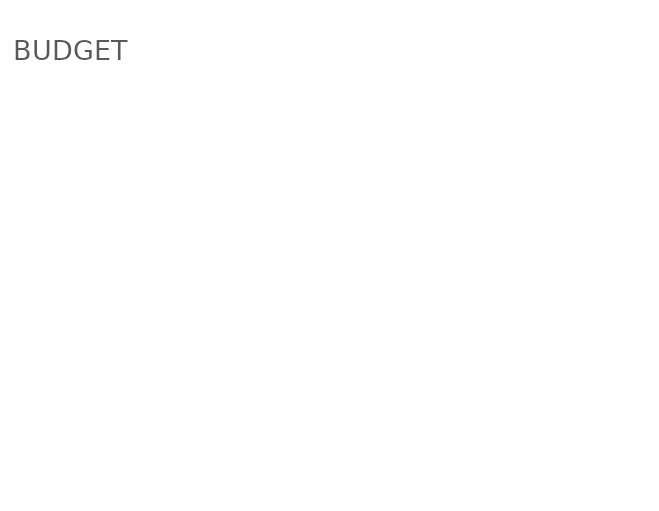
| Category | BUDGET |
|---|---|
| EMPLOI - PERMANENT | 0 |
| EMPLOI - OCCASIONNEL | 0 |
| GÉNÉRAL/ADMINISTRATIF | 0 |
| OPÉRATIONS | 0 |
| MARKETING/PROMOTION | 0 |
| SITE WEB/APPLICATION MOBILE | 0 |
| LOCAL | 0 |
| VÉHICULE | 0 |
| AUTRES | 0 |